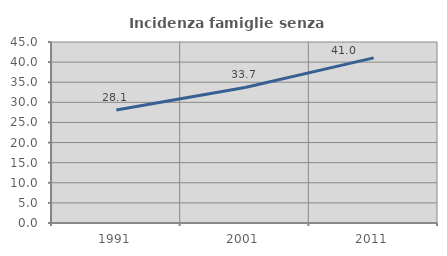
| Category | Incidenza famiglie senza nuclei |
|---|---|
| 1991.0 | 28.08 |
| 2001.0 | 33.692 |
| 2011.0 | 41.046 |